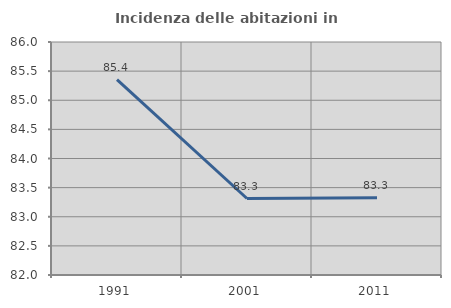
| Category | Incidenza delle abitazioni in proprietà  |
|---|---|
| 1991.0 | 85.353 |
| 2001.0 | 83.313 |
| 2011.0 | 83.327 |